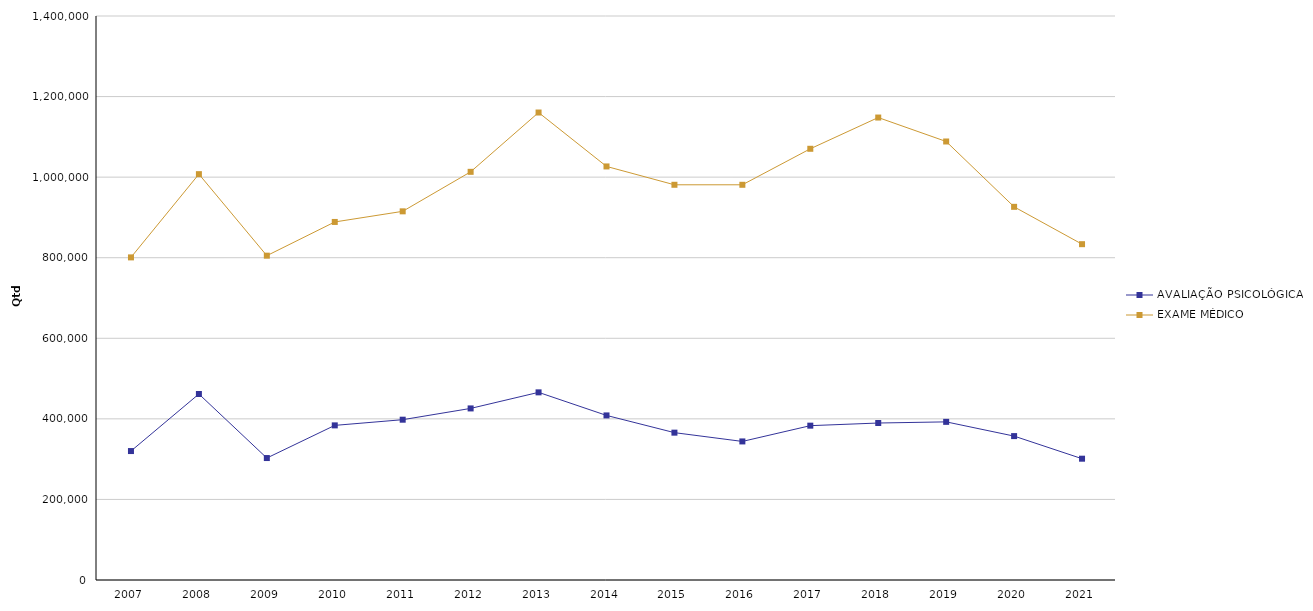
| Category | AVALIAÇÃO PSICOLÓGICA | EXAME MÉDICO |
|---|---|---|
| 2007 | 320087 | 800805 |
| 2008 | 461684 | 1007421 |
| 2009 | 302733 | 805060 |
| 2010 | 383818 | 888764 |
| 2011 | 397914 | 915124 |
| 2012 | 425904 | 1013188 |
| 2013 | 465777 | 1160399 |
| 2014 | 408530 | 1026576 |
| 2015 | 365747 | 981036 |
| 2016 | 343972 | 981030 |
| 2017 | 383105 | 1070389 |
| 2018 | 389671 | 1147939 |
| 2019 | 392530 | 1088505 |
| 2020 | 357213 | 926286 |
| 2021 | 301113 | 833603 |